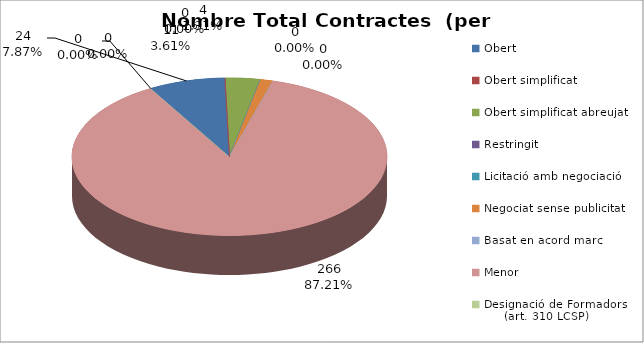
| Category | Nombre Total Contractes |
|---|---|
| Obert | 24 |
| Obert simplificat | 0 |
| Obert simplificat abreujat | 11 |
| Restringit | 0 |
| Licitació amb negociació | 0 |
| Negociat sense publicitat | 4 |
| Basat en acord marc | 0 |
| Menor | 266 |
| Designació de Formadors
     (art. 310 LCSP) | 0 |